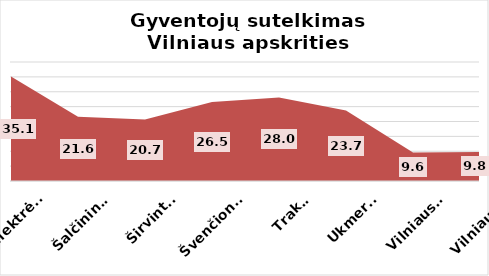
| Category | Series 0 |
|---|---|
| Elektrėnai | 35.13 |
| Šalčininkai | 21.62 |
| Širvintos | 20.71 |
| Švenčionys | 26.54 |
| Trakai | 28.04 |
| Ukmergė | 23.72 |
| Vilniaus r. | 9.6 |
| Vilniaus m. | 9.78 |